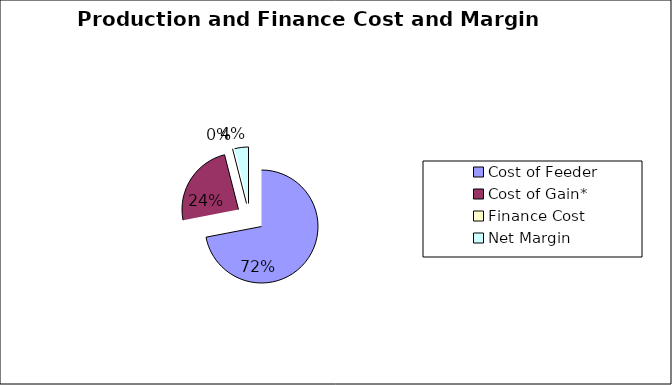
| Category | $/Head |
|---|---|
| Cost of Feeder | 1200 |
| Cost of Gain*  | 401.01 |
| Finance Cost | 0 |
| Net Margin | 66.242 |